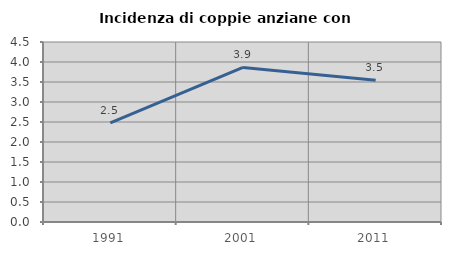
| Category | Incidenza di coppie anziane con figli |
|---|---|
| 1991.0 | 2.477 |
| 2001.0 | 3.864 |
| 2011.0 | 3.541 |